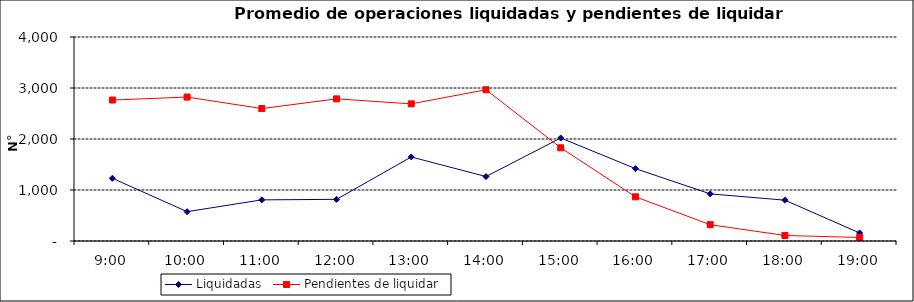
| Category | Liquidadas | Pendientes de liquidar |
|---|---|---|
| 0.375 | 1229.8 | 2764.3 |
| 0.4166666666666667 | 575.15 | 2822.3 |
| 0.4583333333333333 | 806.6 | 2596.65 |
| 0.5 | 816.8 | 2787.35 |
| 0.5416666666666666 | 1647.45 | 2689.3 |
| 0.5833333333333334 | 1264 | 2965.55 |
| 0.625 | 2019.85 | 1827.8 |
| 0.6666666666666666 | 1419.15 | 866.45 |
| 0.7083333333333334 | 923.9 | 319.7 |
| 0.75 | 800.85 | 108.2 |
| 0.7916666666666666 | 157.9 | 68.75 |